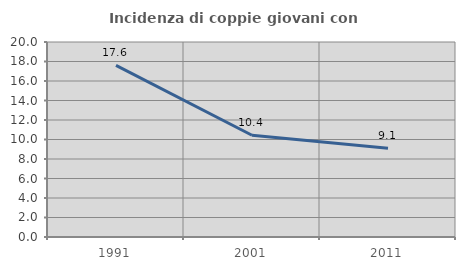
| Category | Incidenza di coppie giovani con figli |
|---|---|
| 1991.0 | 17.611 |
| 2001.0 | 10.437 |
| 2011.0 | 9.097 |